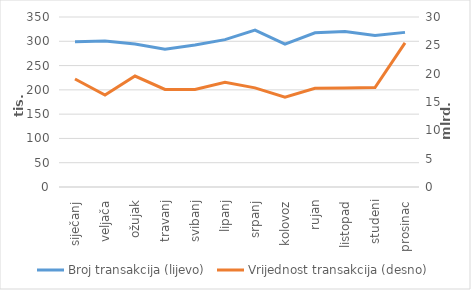
| Category | Broj transakcija (lijevo) |
|---|---|
| siječanj | 299136 |
| veljača | 300816 |
| ožujak | 294361 |
| travanj | 283615 |
| svibanj | 292382 |
| lipanj | 303347 |
| srpanj | 322873 |
| kolovoz | 294112 |
| rujan | 317527 |
| listopad | 319901 |
| studeni | 311685 |
| prosinac | 318340 |